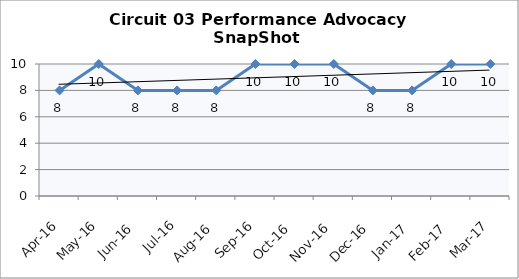
| Category | Circuit 03 |
|---|---|
| Apr-16 | 8 |
| May-16 | 10 |
| Jun-16 | 8 |
| Jul-16 | 8 |
| Aug-16 | 8 |
| Sep-16 | 10 |
| Oct-16 | 10 |
| Nov-16 | 10 |
| Dec-16 | 8 |
| Jan-17 | 8 |
| Feb-17 | 10 |
| Mar-17 | 10 |